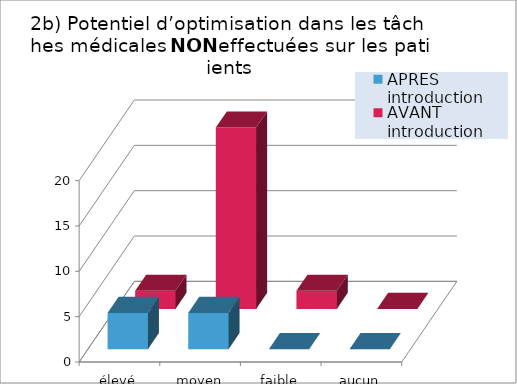
| Category | APRÈS introduction | AVANT introduction |
|---|---|---|
| élevé | 4 | 2 |
| moyen | 4 | 20 |
| faible | 0 | 2 |
| aucun | 0 | 0 |